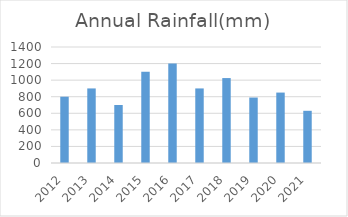
| Category | Annual Rainfall(mm) |
|---|---|
| 2012.0 | 800 |
| 2013.0 | 900 |
| 2014.0 | 700 |
| 2015.0 | 1100 |
| 2016.0 | 1200 |
| 2017.0 | 900 |
| 2018.0 | 1025 |
| 2019.0 | 790 |
| 2020.0 | 850 |
| 2021.0 | 630 |